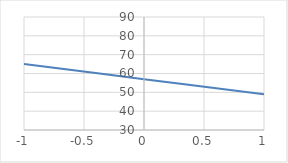
| Category | Series 0 |
|---|---|
| -1.0 | 65 |
| 0.0 | 57 |
| 1.0 | 49 |